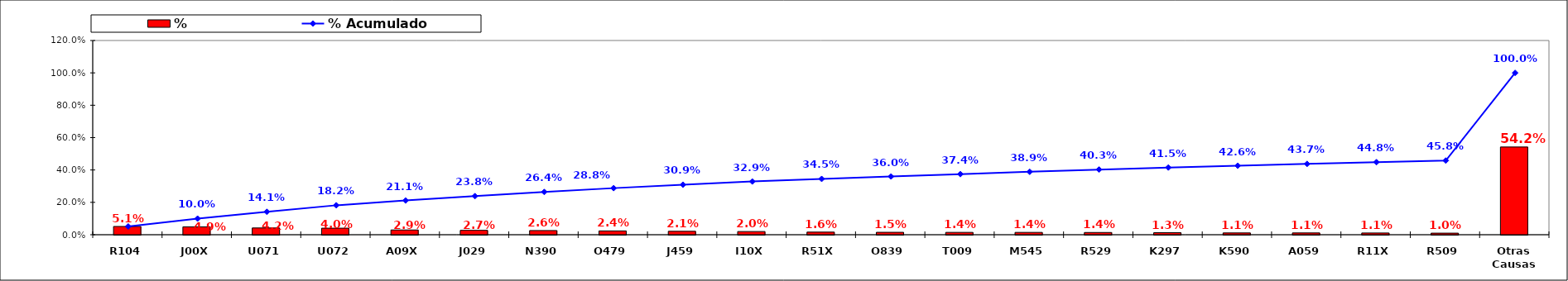
| Category | % |
|---|---|
| R104 | 0.051 |
| J00X | 0.049 |
| U071 | 0.042 |
| U072 | 0.04 |
| A09X | 0.029 |
| J029 | 0.027 |
| N390 | 0.026 |
| O479 | 0.024 |
| J459 | 0.021 |
| I10X | 0.02 |
| R51X | 0.016 |
| O839 | 0.015 |
| T009 | 0.014 |
| M545 | 0.014 |
| R529 | 0.014 |
| K297 | 0.013 |
| K590 | 0.011 |
| A059 | 0.011 |
| R11X | 0.011 |
| R509 | 0.01 |
| Otras Causas | 0.542 |